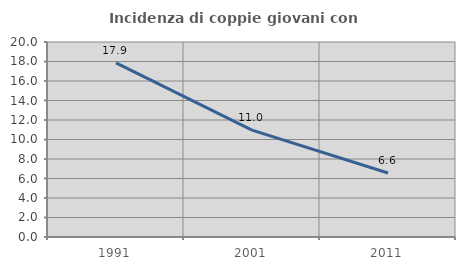
| Category | Incidenza di coppie giovani con figli |
|---|---|
| 1991.0 | 17.857 |
| 2001.0 | 10.967 |
| 2011.0 | 6.567 |